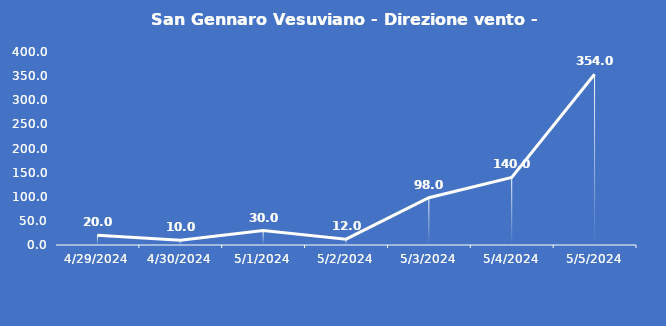
| Category | San Gennaro Vesuviano - Direzione vento - Grezzo (°N) |
|---|---|
| 4/29/24 | 20 |
| 4/30/24 | 10 |
| 5/1/24 | 30 |
| 5/2/24 | 12 |
| 5/3/24 | 98 |
| 5/4/24 | 140 |
| 5/5/24 | 354 |